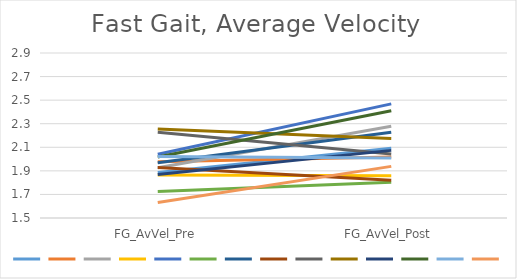
| Category | Series 0 | Series 1 | Series 2 | Series 3 | Series 4 | Series 5 | Series 6 | Series 7 | Series 8 | Series 9 | Series 10 | Series 11 | Series 12 | Series 13 |
|---|---|---|---|---|---|---|---|---|---|---|---|---|---|---|
| FG_AvVel_Pre | 1.887 | 1.977 | 1.926 | 1.864 | 2.041 | 1.725 | 1.969 | 1.929 | 2.227 | 2.255 | 1.869 | 2.017 | 2.021 | 1.631 |
| FG_AvVel_Post | 2.093 | 2.017 | 2.279 | 1.859 | 2.468 | 1.804 | 2.228 | 1.821 | 2.042 | 2.174 | 2.074 | 2.409 | 2.01 | 1.938 |